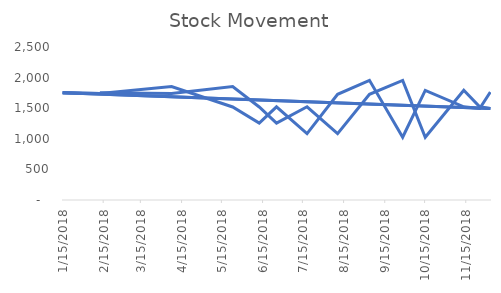
| Category | Stock Movement |
|---|---|
| 2/12/18 | 1754 |
| 4/7/18 | 1739 |
| 5/23/18 | 1853 |
| 6/12/18 | 1520 |
| 6/25/18 | 1257 |
| 7/18/18 | 1523 |
| 8/10/18 | 1085 |
| 9/3/18 | 1727 |
| 9/28/18 | 1955 |
| 10/15/18 | 1026 |
| 11/13/18 | 1792 |
| 11/25/18 | 1523 |
| 12/3/18 | 1495 |
| 1/15/18 | 1754 |
| 2/12/18 | 1739 |
| 4/7/18 | 1853 |
| 5/23/18 | 1520 |
| 6/12/18 | 1257 |
| 6/25/18 | 1523 |
| 7/18/18 | 1085 |
| 8/10/18 | 1727 |
| 9/3/18 | 1955 |
| 9/28/18 | 1026 |
| 10/15/18 | 1792 |
| 11/13/18 | 1523 |
| 11/25/18 | 1495 |
| 12/3/18 | 1765 |